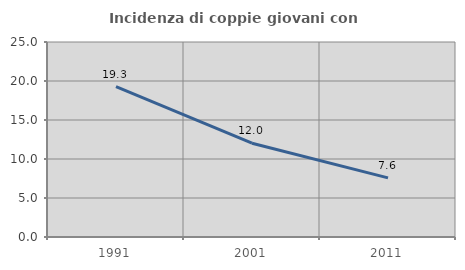
| Category | Incidenza di coppie giovani con figli |
|---|---|
| 1991.0 | 19.268 |
| 2001.0 | 12.023 |
| 2011.0 | 7.58 |